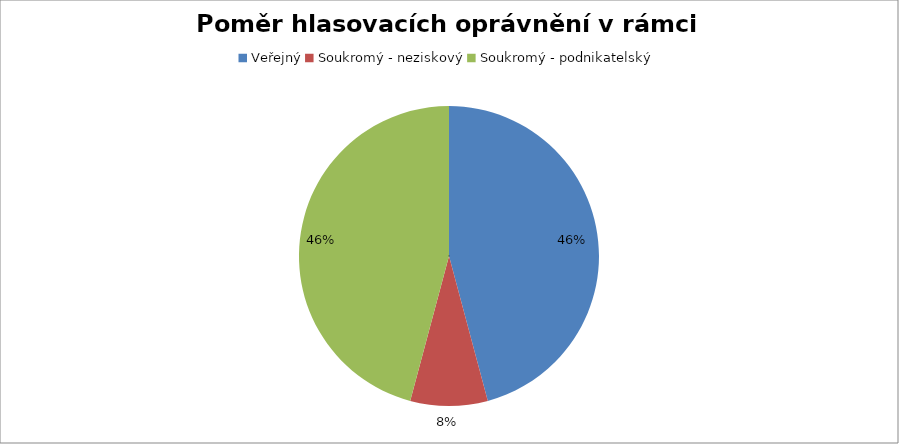
| Category | Series 0 |
|---|---|
| Veřejný | 0.458 |
| Soukromý - neziskový | 0.083 |
| Soukromý - podnikatelský | 0.458 |